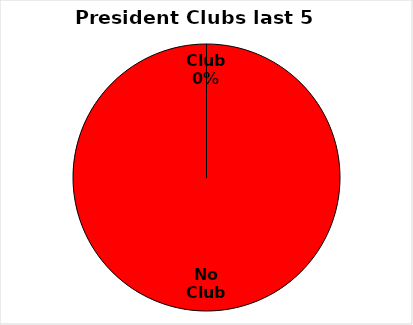
| Category | Series 0 |
|---|---|
| No Club | 1 |
| Club | 0 |